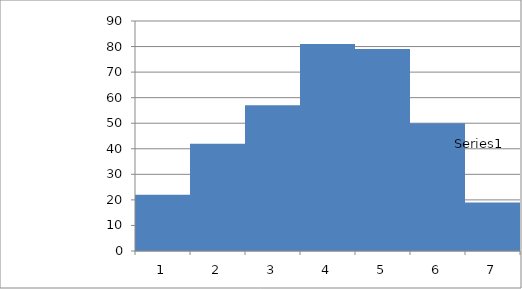
| Category | Series 0 |
|---|---|
| 0 | 22 |
| 1 | 42 |
| 2 | 57 |
| 3 | 81 |
| 4 | 79 |
| 5 | 50 |
| 6 | 19 |